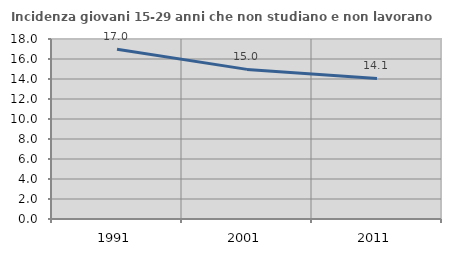
| Category | Incidenza giovani 15-29 anni che non studiano e non lavorano  |
|---|---|
| 1991.0 | 16.968 |
| 2001.0 | 14.962 |
| 2011.0 | 14.056 |